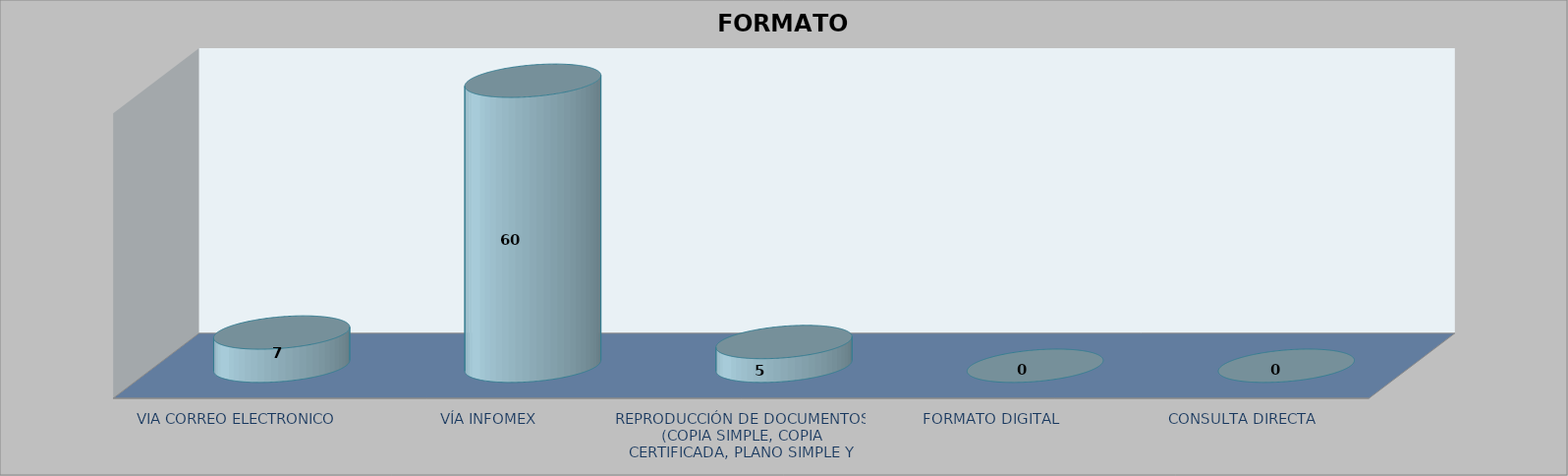
| Category |        FORMATO SOLICITADO | Series 1 | Series 2 |
|---|---|---|---|
| VIA CORREO ELECTRONICO |  |  | 7 |
| VÍA INFOMEX |  |  | 60 |
| REPRODUCCIÓN DE DOCUMENTOS (COPIA SIMPLE, COPIA CERTIFICADA, PLANO SIMPLE Y PLANO CERTIFICADO) |  |  | 5 |
| FORMATO DIGITAL |  |  | 0 |
| CONSULTA DIRECTA |  |  | 0 |